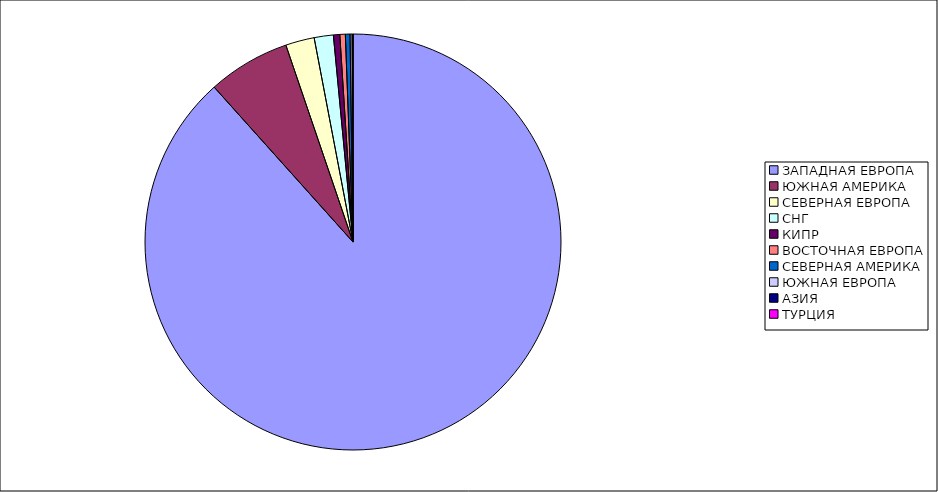
| Category | Оборот |
|---|---|
| ЗАПАДНАЯ ЕВРОПА | 0.884 |
| ЮЖНАЯ АМЕРИКА | 0.064 |
| СЕВЕРНАЯ ЕВРОПА | 0.022 |
| СНГ | 0.015 |
| КИПР | 0.005 |
| ВОСТОЧНАЯ ЕВРОПА | 0.004 |
| СЕВЕРНАЯ АМЕРИКА | 0.004 |
| ЮЖНАЯ ЕВРОПА | 0.002 |
| АЗИЯ | 0.001 |
| ТУРЦИЯ | 0 |